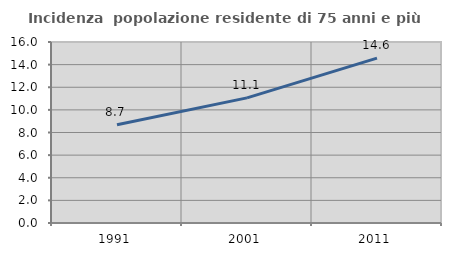
| Category | Incidenza  popolazione residente di 75 anni e più |
|---|---|
| 1991.0 | 8.679 |
| 2001.0 | 11.063 |
| 2011.0 | 14.579 |